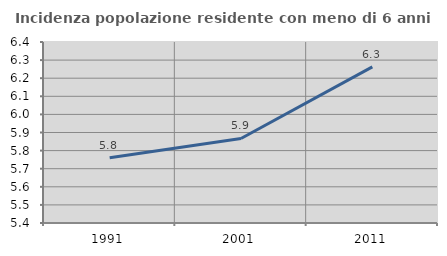
| Category | Incidenza popolazione residente con meno di 6 anni |
|---|---|
| 1991.0 | 5.76 |
| 2001.0 | 5.867 |
| 2011.0 | 6.263 |